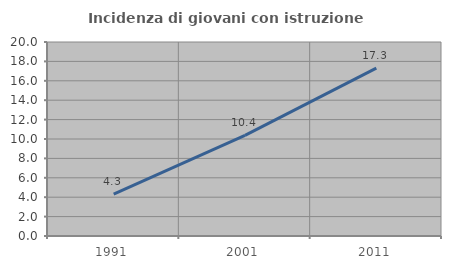
| Category | Incidenza di giovani con istruzione universitaria |
|---|---|
| 1991.0 | 4.324 |
| 2001.0 | 10.367 |
| 2011.0 | 17.298 |